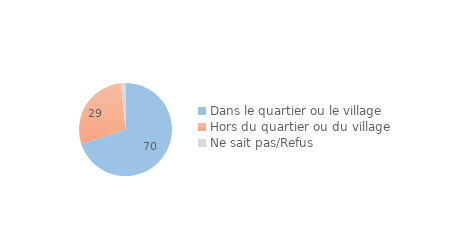
| Category | Series 0 |
|---|---|
| Dans le quartier ou le village | 69.864 |
| Hors du quartier ou du village | 28.588 |
| Ne sait pas/Refus | 1.548 |